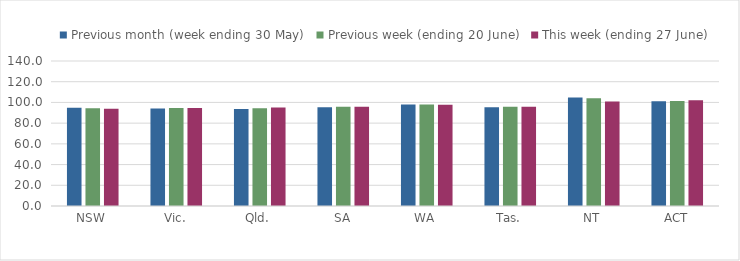
| Category | Previous month (week ending 30 May) | Previous week (ending 20 June) | This week (ending 27 June) |
|---|---|---|---|
| NSW | 94.844 | 94.358 | 93.804 |
| Vic. | 94.14 | 94.605 | 94.649 |
| Qld. | 93.746 | 94.325 | 95.019 |
| SA | 95.284 | 95.783 | 95.9 |
| WA | 98.105 | 98.09 | 97.871 |
| Tas. | 95.444 | 95.925 | 95.795 |
| NT | 104.754 | 104.032 | 100.831 |
| ACT | 101.053 | 101.316 | 102 |